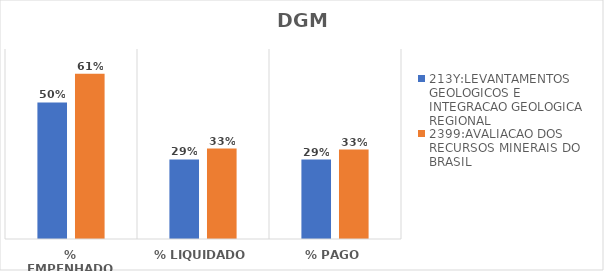
| Category | 213Y:LEVANTAMENTOS GEOLOGICOS E INTEGRACAO GEOLOGICA REGIONAL | 2399:AVALIACAO DOS RECURSOS MINERAIS DO BRASIL |
|---|---|---|
| % EMPENHADO | 0.503 | 0.609 |
| % LIQUIDADO | 0.293 | 0.333 |
| % PAGO | 0.293 | 0.33 |